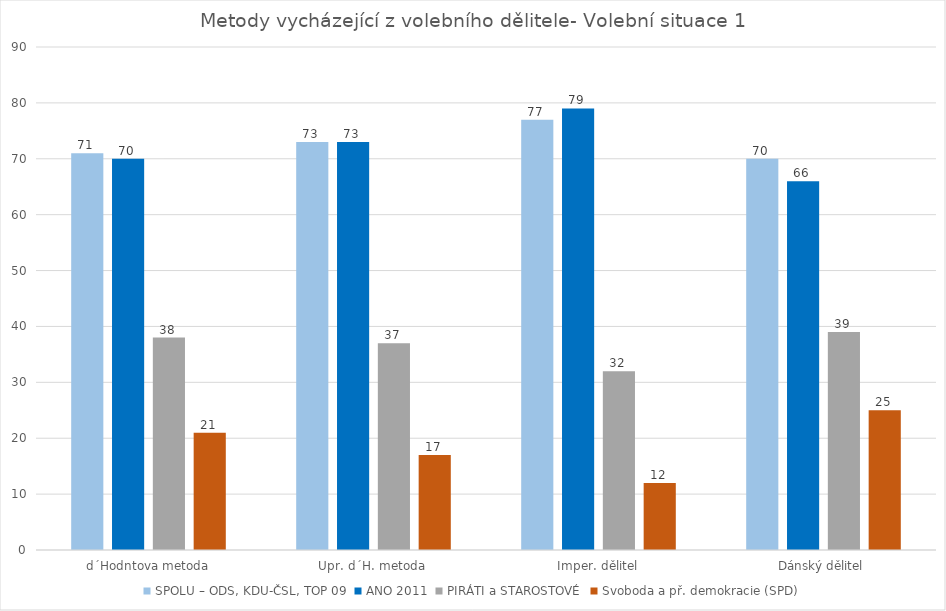
| Category | SPOLU – ODS, KDU-ČSL, TOP 09 | ANO 2011 | PIRÁTI a STAROSTOVÉ | Svoboda a př. demokracie (SPD) |
|---|---|---|---|---|
| d´Hodntova metoda | 71 | 70 | 38 | 21 |
| Upr. d´H. metoda | 73 | 73 | 37 | 17 |
| Imper. dělitel | 77 | 79 | 32 | 12 |
| Dánský dělitel | 70 | 66 | 39 | 25 |